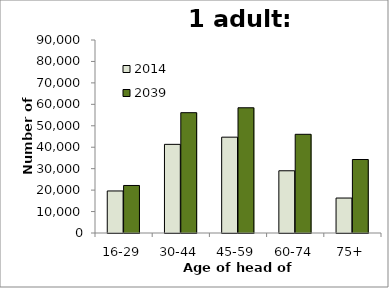
| Category | 2014 | 2039 |
|---|---|---|
| 16-29 | 19601 | 22164 |
| 30-44 | 41337 | 56106 |
| 45-59 | 44692 | 58394 |
| 60-74 | 29020 | 46022 |
| 75+ | 16304 | 34274 |